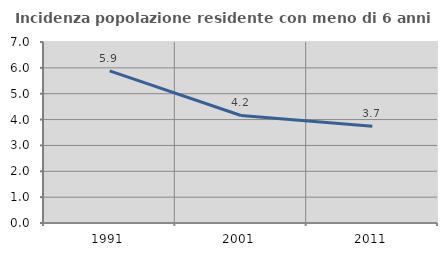
| Category | Incidenza popolazione residente con meno di 6 anni |
|---|---|
| 1991.0 | 5.885 |
| 2001.0 | 4.159 |
| 2011.0 | 3.738 |